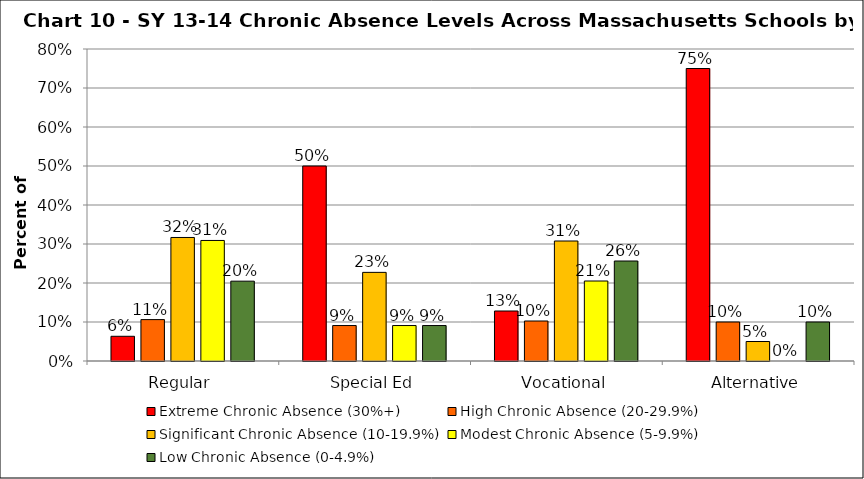
| Category | Extreme Chronic Absence (30%+) | High Chronic Absence (20-29.9%) | Significant Chronic Absence (10-19.9%) | Modest Chronic Absence (5-9.9%) | Low Chronic Absence (0-4.9%) |
|---|---|---|---|---|---|
| 0 | 0.063 | 0.106 | 0.317 | 0.309 | 0.205 |
| 1 | 0.5 | 0.091 | 0.227 | 0.091 | 0.091 |
| 2 | 0.128 | 0.103 | 0.308 | 0.205 | 0.256 |
| 3 | 0.75 | 0.1 | 0.05 | 0 | 0.1 |